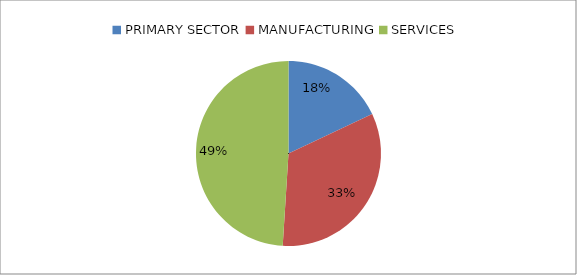
| Category | in VA terms |
|---|---|
| PRIMARY SECTOR | 18 |
| MANUFACTURING | 33 |
| SERVICES | 49 |